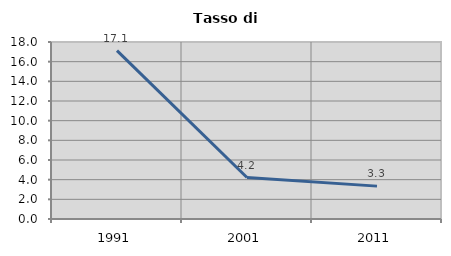
| Category | Tasso di disoccupazione   |
|---|---|
| 1991.0 | 17.122 |
| 2001.0 | 4.217 |
| 2011.0 | 3.343 |